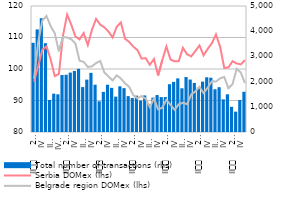
| Category | Total number of transactions (rhs) |
|---|---|
| I | 3540 |
| II
     2008 | 4071 |
| III | 4515 |
| IV | 3524 |
| I
2009 | 1271 |
| II
      | 1521 |
| III | 1495 |
| IV
 | 2262 |
| I
 | 2272 |
| II
     2010 | 2357 |
| III | 2422 |
| IV | 2508 |
| I
2011 | 1782 |
| II
 | 2078 |
| III | 2347 |
| IV | 1877 |
| I
2012 | 1218 |
| II
     2012 | 1592 |
| III | 1875 |
| IV | 1752 |
| I
2013 | 1403 |
| II
 | 1813 |
| III | 1741 |
| IV | 1424 |
| I
 | 1351 |
| II
     2014 | 1443 |
| III | 1247 |
| IV | 1451 |
| I
2015 | 1113 |
| II
   | 1363 |
| III | 1466 |
| IV | 1385 |
| I
 | 1384 |
| II
     2016 | 1897 |
| III | 1989 |
| IV | 2128 |
| I
2017 | 1735 |
| II
     | 2181 |
| III | 2081 |
| IV | 1948 |
| I
 | 1765 |
| II
     2018 | 1999 |
| III | 2171 |
| IV | 2154 |
| I
2019 | 1697 |
| II
 | 1778 |
| III | 1295 |